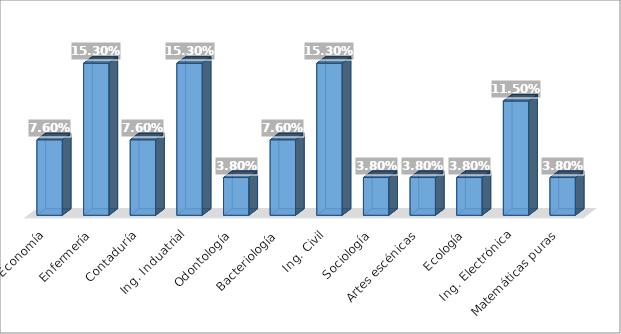
| Category | 8. ¿Què carrera estudia? |
|---|---|
| Economía | 0.076 |
| Enfermería | 0.153 |
| Contaduría | 0.076 |
| Ing. Induatrial | 0.153 |
| Odontología | 0.038 |
| Bacteriología | 0.076 |
| Ing. Civil | 0.153 |
| Sociología | 0.038 |
| Artes escénicas | 0.038 |
| Ecología | 0.038 |
| Ing. Electrónica | 0.115 |
| Matemáticas puras | 0.038 |